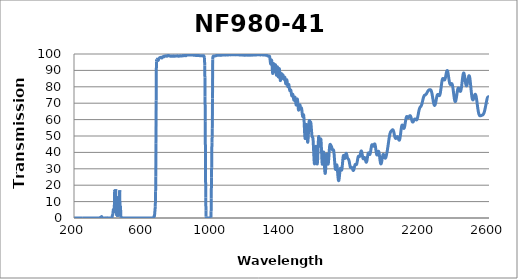
| Category | Transmission (%) |
|---|---|
| 2600.0 | 73.48 |
| 2599.0 | 73.645 |
| 2598.0 | 73.816 |
| 2597.0 | 73.891 |
| 2596.0 | 73.89 |
| 2595.0 | 73.862 |
| 2594.0 | 73.802 |
| 2593.0 | 73.691 |
| 2592.0 | 73.519 |
| 2591.0 | 73.297 |
| 2590.0 | 73.026 |
| 2589.0 | 72.665 |
| 2588.0 | 72.265 |
| 2587.0 | 71.8 |
| 2586.0 | 71.317 |
| 2585.0 | 70.806 |
| 2584.0 | 70.241 |
| 2583.0 | 69.645 |
| 2582.0 | 69.094 |
| 2581.0 | 68.533 |
| 2580.0 | 67.994 |
| 2579.0 | 67.481 |
| 2578.0 | 66.955 |
| 2577.0 | 66.455 |
| 2576.0 | 65.949 |
| 2575.0 | 65.496 |
| 2574.0 | 65.082 |
| 2573.0 | 64.707 |
| 2572.0 | 64.376 |
| 2571.0 | 64.076 |
| 2570.0 | 63.812 |
| 2569.0 | 63.601 |
| 2568.0 | 63.413 |
| 2567.0 | 63.256 |
| 2566.0 | 63.111 |
| 2565.0 | 62.979 |
| 2564.0 | 62.89 |
| 2563.0 | 62.814 |
| 2562.0 | 62.753 |
| 2561.0 | 62.719 |
| 2560.0 | 62.673 |
| 2559.0 | 62.64 |
| 2558.0 | 62.602 |
| 2557.0 | 62.563 |
| 2556.0 | 62.519 |
| 2555.0 | 62.472 |
| 2554.0 | 62.424 |
| 2553.0 | 62.378 |
| 2552.0 | 62.334 |
| 2551.0 | 62.303 |
| 2550.0 | 62.281 |
| 2549.0 | 62.283 |
| 2548.0 | 62.291 |
| 2547.0 | 62.346 |
| 2546.0 | 62.429 |
| 2545.0 | 62.564 |
| 2544.0 | 62.737 |
| 2543.0 | 62.965 |
| 2542.0 | 63.262 |
| 2541.0 | 63.615 |
| 2540.0 | 64.023 |
| 2539.0 | 64.515 |
| 2538.0 | 65.075 |
| 2537.0 | 65.663 |
| 2536.0 | 66.332 |
| 2535.0 | 67.04 |
| 2534.0 | 67.807 |
| 2533.0 | 68.609 |
| 2532.0 | 69.443 |
| 2531.0 | 70.247 |
| 2530.0 | 71.024 |
| 2529.0 | 71.798 |
| 2528.0 | 72.547 |
| 2527.0 | 73.227 |
| 2526.0 | 73.838 |
| 2525.0 | 74.342 |
| 2524.0 | 74.753 |
| 2523.0 | 75.061 |
| 2522.0 | 75.291 |
| 2521.0 | 75.414 |
| 2520.0 | 75.431 |
| 2519.0 | 75.343 |
| 2518.0 | 75.179 |
| 2517.0 | 74.941 |
| 2516.0 | 74.632 |
| 2515.0 | 74.277 |
| 2514.0 | 73.897 |
| 2513.0 | 73.502 |
| 2512.0 | 73.104 |
| 2511.0 | 72.762 |
| 2510.0 | 72.457 |
| 2509.0 | 72.216 |
| 2508.0 | 72.055 |
| 2507.0 | 71.998 |
| 2506.0 | 72.042 |
| 2505.0 | 72.205 |
| 2504.0 | 72.475 |
| 2503.0 | 72.874 |
| 2502.0 | 73.394 |
| 2501.0 | 74.021 |
| 2500.0 | 74.799 |
| 2499.0 | 75.648 |
| 2498.0 | 76.582 |
| 2497.0 | 77.574 |
| 2496.0 | 78.641 |
| 2495.0 | 79.709 |
| 2494.0 | 80.819 |
| 2493.0 | 81.905 |
| 2492.0 | 82.885 |
| 2491.0 | 83.83 |
| 2490.0 | 84.66 |
| 2489.0 | 85.374 |
| 2488.0 | 85.951 |
| 2487.0 | 86.399 |
| 2486.0 | 86.641 |
| 2485.0 | 86.753 |
| 2484.0 | 86.703 |
| 2483.0 | 86.487 |
| 2482.0 | 86.164 |
| 2481.0 | 85.706 |
| 2480.0 | 85.165 |
| 2479.0 | 84.574 |
| 2478.0 | 83.962 |
| 2477.0 | 83.313 |
| 2476.0 | 82.692 |
| 2475.0 | 82.105 |
| 2474.0 | 81.574 |
| 2473.0 | 81.156 |
| 2472.0 | 80.832 |
| 2471.0 | 80.618 |
| 2470.0 | 80.539 |
| 2469.0 | 80.588 |
| 2468.0 | 80.776 |
| 2467.0 | 81.104 |
| 2466.0 | 81.511 |
| 2465.0 | 82.063 |
| 2464.0 | 82.676 |
| 2463.0 | 83.356 |
| 2462.0 | 84.101 |
| 2461.0 | 84.879 |
| 2460.0 | 85.626 |
| 2459.0 | 86.305 |
| 2458.0 | 86.956 |
| 2457.0 | 87.514 |
| 2456.0 | 87.94 |
| 2455.0 | 88.262 |
| 2454.0 | 88.417 |
| 2453.0 | 88.401 |
| 2452.0 | 88.231 |
| 2451.0 | 87.897 |
| 2450.0 | 87.414 |
| 2449.0 | 86.792 |
| 2448.0 | 86.034 |
| 2447.0 | 85.212 |
| 2446.0 | 84.332 |
| 2445.0 | 83.421 |
| 2444.0 | 82.482 |
| 2443.0 | 81.568 |
| 2442.0 | 80.684 |
| 2441.0 | 79.868 |
| 2440.0 | 79.182 |
| 2439.0 | 78.57 |
| 2438.0 | 78.066 |
| 2437.0 | 77.67 |
| 2436.0 | 77.393 |
| 2435.0 | 77.236 |
| 2434.0 | 77.188 |
| 2433.0 | 77.232 |
| 2432.0 | 77.375 |
| 2431.0 | 77.585 |
| 2430.0 | 77.843 |
| 2429.0 | 78.139 |
| 2428.0 | 78.441 |
| 2427.0 | 78.725 |
| 2426.0 | 78.967 |
| 2425.0 | 79.174 |
| 2424.0 | 79.293 |
| 2423.0 | 79.322 |
| 2422.0 | 79.244 |
| 2421.0 | 79.073 |
| 2420.0 | 78.78 |
| 2419.0 | 78.386 |
| 2418.0 | 77.897 |
| 2417.0 | 77.31 |
| 2416.0 | 76.648 |
| 2415.0 | 75.953 |
| 2414.0 | 75.245 |
| 2413.0 | 74.509 |
| 2412.0 | 73.805 |
| 2411.0 | 73.144 |
| 2410.0 | 72.514 |
| 2409.0 | 71.986 |
| 2408.0 | 71.572 |
| 2407.0 | 71.254 |
| 2406.0 | 71.051 |
| 2405.0 | 70.975 |
| 2404.0 | 71.02 |
| 2403.0 | 71.213 |
| 2402.0 | 71.531 |
| 2401.0 | 71.955 |
| 2400.0 | 72.491 |
| 2399.0 | 73.141 |
| 2398.0 | 73.857 |
| 2397.0 | 74.664 |
| 2396.0 | 75.534 |
| 2395.0 | 76.355 |
| 2394.0 | 77.234 |
| 2393.0 | 78.05 |
| 2392.0 | 78.836 |
| 2391.0 | 79.577 |
| 2390.0 | 80.234 |
| 2389.0 | 80.783 |
| 2388.0 | 81.218 |
| 2387.0 | 81.554 |
| 2386.0 | 81.79 |
| 2385.0 | 81.924 |
| 2384.0 | 81.962 |
| 2383.0 | 81.937 |
| 2382.0 | 81.867 |
| 2381.0 | 81.743 |
| 2380.0 | 81.615 |
| 2379.0 | 81.516 |
| 2378.0 | 81.428 |
| 2377.0 | 81.401 |
| 2376.0 | 81.439 |
| 2375.0 | 81.558 |
| 2374.0 | 81.757 |
| 2373.0 | 82.072 |
| 2372.0 | 82.455 |
| 2371.0 | 82.949 |
| 2370.0 | 83.546 |
| 2369.0 | 84.166 |
| 2368.0 | 84.867 |
| 2367.0 | 85.596 |
| 2366.0 | 86.332 |
| 2365.0 | 87.086 |
| 2364.0 | 87.778 |
| 2363.0 | 88.403 |
| 2362.0 | 88.924 |
| 2361.0 | 89.36 |
| 2360.0 | 89.672 |
| 2359.0 | 89.865 |
| 2358.0 | 89.915 |
| 2357.0 | 89.815 |
| 2356.0 | 89.611 |
| 2355.0 | 89.287 |
| 2354.0 | 88.859 |
| 2353.0 | 88.369 |
| 2352.0 | 87.81 |
| 2351.0 | 87.214 |
| 2350.0 | 86.666 |
| 2349.0 | 86.13 |
| 2348.0 | 85.616 |
| 2347.0 | 85.165 |
| 2346.0 | 84.815 |
| 2345.0 | 84.521 |
| 2344.0 | 84.316 |
| 2343.0 | 84.219 |
| 2342.0 | 84.184 |
| 2341.0 | 84.228 |
| 2340.0 | 84.344 |
| 2339.0 | 84.488 |
| 2338.0 | 84.649 |
| 2337.0 | 84.813 |
| 2336.0 | 84.971 |
| 2335.0 | 85.062 |
| 2334.0 | 85.102 |
| 2333.0 | 85.073 |
| 2332.0 | 84.92 |
| 2331.0 | 84.688 |
| 2330.0 | 84.342 |
| 2329.0 | 83.886 |
| 2328.0 | 83.319 |
| 2327.0 | 82.695 |
| 2326.0 | 81.967 |
| 2325.0 | 81.157 |
| 2324.0 | 80.389 |
| 2323.0 | 79.572 |
| 2322.0 | 78.752 |
| 2321.0 | 77.996 |
| 2320.0 | 77.27 |
| 2319.0 | 76.609 |
| 2318.0 | 76.034 |
| 2317.0 | 75.582 |
| 2316.0 | 75.2 |
| 2315.0 | 74.91 |
| 2314.0 | 74.72 |
| 2313.0 | 74.625 |
| 2312.0 | 74.594 |
| 2311.0 | 74.645 |
| 2310.0 | 74.748 |
| 2309.0 | 74.876 |
| 2308.0 | 75.006 |
| 2307.0 | 75.158 |
| 2306.0 | 75.267 |
| 2305.0 | 75.321 |
| 2304.0 | 75.345 |
| 2303.0 | 75.289 |
| 2302.0 | 75.146 |
| 2301.0 | 74.937 |
| 2300.0 | 74.641 |
| 2299.0 | 74.253 |
| 2298.0 | 73.844 |
| 2297.0 | 73.347 |
| 2296.0 | 72.811 |
| 2295.0 | 72.238 |
| 2294.0 | 71.664 |
| 2293.0 | 71.085 |
| 2292.0 | 70.544 |
| 2291.0 | 70.058 |
| 2290.0 | 69.624 |
| 2289.0 | 69.247 |
| 2288.0 | 68.959 |
| 2287.0 | 68.758 |
| 2286.0 | 68.652 |
| 2285.0 | 68.634 |
| 2284.0 | 68.744 |
| 2283.0 | 68.923 |
| 2282.0 | 69.189 |
| 2281.0 | 69.565 |
| 2280.0 | 70.014 |
| 2279.0 | 70.476 |
| 2278.0 | 71.038 |
| 2277.0 | 71.641 |
| 2276.0 | 72.264 |
| 2275.0 | 72.927 |
| 2274.0 | 73.6 |
| 2273.0 | 74.25 |
| 2272.0 | 74.836 |
| 2271.0 | 75.431 |
| 2270.0 | 75.963 |
| 2269.0 | 76.422 |
| 2268.0 | 76.846 |
| 2267.0 | 77.219 |
| 2266.0 | 77.503 |
| 2265.0 | 77.741 |
| 2264.0 | 77.924 |
| 2263.0 | 78.06 |
| 2262.0 | 78.161 |
| 2261.0 | 78.226 |
| 2260.0 | 78.261 |
| 2259.0 | 78.273 |
| 2258.0 | 78.264 |
| 2257.0 | 78.247 |
| 2256.0 | 78.216 |
| 2255.0 | 78.173 |
| 2254.0 | 78.124 |
| 2253.0 | 78.062 |
| 2252.0 | 77.989 |
| 2251.0 | 77.913 |
| 2250.0 | 77.819 |
| 2249.0 | 77.701 |
| 2248.0 | 77.565 |
| 2247.0 | 77.428 |
| 2246.0 | 77.262 |
| 2245.0 | 77.087 |
| 2244.0 | 76.902 |
| 2243.0 | 76.699 |
| 2242.0 | 76.494 |
| 2241.0 | 76.286 |
| 2240.0 | 76.1 |
| 2239.0 | 75.902 |
| 2238.0 | 75.727 |
| 2237.0 | 75.577 |
| 2236.0 | 75.43 |
| 2235.0 | 75.314 |
| 2234.0 | 75.229 |
| 2233.0 | 75.156 |
| 2232.0 | 75.091 |
| 2231.0 | 75.046 |
| 2230.0 | 74.994 |
| 2229.0 | 74.944 |
| 2228.0 | 74.886 |
| 2227.0 | 74.808 |
| 2226.0 | 74.685 |
| 2225.0 | 74.539 |
| 2224.0 | 74.351 |
| 2223.0 | 74.108 |
| 2222.0 | 73.822 |
| 2221.0 | 73.502 |
| 2220.0 | 73.138 |
| 2219.0 | 72.728 |
| 2218.0 | 72.288 |
| 2217.0 | 71.837 |
| 2216.0 | 71.35 |
| 2215.0 | 70.902 |
| 2214.0 | 70.453 |
| 2213.0 | 70.024 |
| 2212.0 | 69.616 |
| 2211.0 | 69.269 |
| 2210.0 | 68.939 |
| 2209.0 | 68.655 |
| 2208.0 | 68.435 |
| 2207.0 | 68.238 |
| 2206.0 | 68.068 |
| 2205.0 | 67.94 |
| 2204.0 | 67.816 |
| 2203.0 | 67.692 |
| 2202.0 | 67.549 |
| 2201.0 | 67.406 |
| 2200.0 | 67.214 |
| 2199.0 | 66.971 |
| 2198.0 | 66.693 |
| 2197.0 | 66.351 |
| 2196.0 | 65.948 |
| 2195.0 | 65.509 |
| 2194.0 | 65.024 |
| 2193.0 | 64.483 |
| 2192.0 | 63.94 |
| 2191.0 | 63.362 |
| 2190.0 | 62.793 |
| 2189.0 | 62.258 |
| 2188.0 | 61.761 |
| 2187.0 | 61.277 |
| 2186.0 | 60.868 |
| 2185.0 | 60.537 |
| 2184.0 | 60.243 |
| 2183.0 | 60.035 |
| 2182.0 | 59.906 |
| 2181.0 | 59.826 |
| 2180.0 | 59.809 |
| 2179.0 | 59.844 |
| 2178.0 | 59.92 |
| 2177.0 | 60.008 |
| 2176.0 | 60.11 |
| 2175.0 | 60.217 |
| 2174.0 | 60.302 |
| 2173.0 | 60.358 |
| 2172.0 | 60.383 |
| 2171.0 | 60.359 |
| 2170.0 | 60.28 |
| 2169.0 | 60.165 |
| 2168.0 | 60.013 |
| 2167.0 | 59.803 |
| 2166.0 | 59.594 |
| 2165.0 | 59.365 |
| 2164.0 | 59.128 |
| 2163.0 | 58.923 |
| 2162.0 | 58.749 |
| 2161.0 | 58.607 |
| 2160.0 | 58.517 |
| 2159.0 | 58.501 |
| 2158.0 | 58.539 |
| 2157.0 | 58.665 |
| 2156.0 | 58.853 |
| 2155.0 | 59.108 |
| 2154.0 | 59.414 |
| 2153.0 | 59.765 |
| 2152.0 | 60.166 |
| 2151.0 | 60.567 |
| 2150.0 | 60.958 |
| 2149.0 | 61.335 |
| 2148.0 | 61.674 |
| 2147.0 | 61.95 |
| 2146.0 | 62.184 |
| 2145.0 | 62.34 |
| 2144.0 | 62.414 |
| 2143.0 | 62.418 |
| 2142.0 | 62.358 |
| 2141.0 | 62.243 |
| 2140.0 | 62.091 |
| 2139.0 | 61.909 |
| 2138.0 | 61.715 |
| 2137.0 | 61.548 |
| 2136.0 | 61.387 |
| 2135.0 | 61.267 |
| 2134.0 | 61.195 |
| 2133.0 | 61.173 |
| 2132.0 | 61.205 |
| 2131.0 | 61.277 |
| 2130.0 | 61.378 |
| 2129.0 | 61.521 |
| 2128.0 | 61.647 |
| 2127.0 | 61.766 |
| 2126.0 | 61.852 |
| 2125.0 | 61.882 |
| 2124.0 | 61.822 |
| 2123.0 | 61.689 |
| 2122.0 | 61.444 |
| 2121.0 | 61.105 |
| 2120.0 | 60.643 |
| 2119.0 | 60.122 |
| 2118.0 | 59.53 |
| 2117.0 | 58.871 |
| 2116.0 | 58.2 |
| 2115.0 | 57.515 |
| 2114.0 | 56.831 |
| 2113.0 | 56.22 |
| 2112.0 | 55.701 |
| 2111.0 | 55.265 |
| 2110.0 | 54.931 |
| 2109.0 | 54.726 |
| 2108.0 | 54.636 |
| 2107.0 | 54.646 |
| 2106.0 | 54.795 |
| 2105.0 | 55.013 |
| 2104.0 | 55.291 |
| 2103.0 | 55.623 |
| 2102.0 | 55.955 |
| 2101.0 | 56.256 |
| 2100.0 | 56.51 |
| 2099.0 | 56.663 |
| 2098.0 | 56.703 |
| 2097.0 | 56.618 |
| 2096.0 | 56.375 |
| 2095.0 | 55.997 |
| 2094.0 | 55.463 |
| 2093.0 | 54.796 |
| 2092.0 | 54.087 |
| 2091.0 | 53.266 |
| 2090.0 | 52.402 |
| 2089.0 | 51.536 |
| 2088.0 | 50.681 |
| 2087.0 | 49.887 |
| 2086.0 | 49.203 |
| 2085.0 | 48.611 |
| 2084.0 | 48.133 |
| 2083.0 | 47.773 |
| 2082.0 | 47.553 |
| 2081.0 | 47.446 |
| 2080.0 | 47.465 |
| 2079.0 | 47.586 |
| 2078.0 | 47.769 |
| 2077.0 | 48.042 |
| 2076.0 | 48.322 |
| 2075.0 | 48.636 |
| 2074.0 | 48.939 |
| 2073.0 | 49.193 |
| 2072.0 | 49.405 |
| 2071.0 | 49.546 |
| 2070.0 | 49.627 |
| 2069.0 | 49.628 |
| 2068.0 | 49.558 |
| 2067.0 | 49.439 |
| 2066.0 | 49.283 |
| 2065.0 | 49.1 |
| 2064.0 | 48.902 |
| 2063.0 | 48.734 |
| 2062.0 | 48.599 |
| 2061.0 | 48.511 |
| 2060.0 | 48.518 |
| 2059.0 | 48.582 |
| 2058.0 | 48.739 |
| 2057.0 | 48.976 |
| 2056.0 | 49.307 |
| 2055.0 | 49.702 |
| 2054.0 | 50.144 |
| 2053.0 | 50.632 |
| 2052.0 | 51.136 |
| 2051.0 | 51.632 |
| 2050.0 | 52.117 |
| 2049.0 | 52.567 |
| 2048.0 | 52.96 |
| 2047.0 | 53.273 |
| 2046.0 | 53.521 |
| 2045.0 | 53.683 |
| 2044.0 | 53.789 |
| 2043.0 | 53.816 |
| 2042.0 | 53.798 |
| 2041.0 | 53.727 |
| 2040.0 | 53.64 |
| 2039.0 | 53.522 |
| 2038.0 | 53.4 |
| 2037.0 | 53.277 |
| 2036.0 | 53.157 |
| 2035.0 | 53.04 |
| 2034.0 | 52.923 |
| 2033.0 | 52.807 |
| 2032.0 | 52.655 |
| 2031.0 | 52.485 |
| 2030.0 | 52.274 |
| 2029.0 | 52.01 |
| 2028.0 | 51.693 |
| 2027.0 | 51.311 |
| 2026.0 | 50.866 |
| 2025.0 | 50.344 |
| 2024.0 | 49.755 |
| 2023.0 | 49.111 |
| 2022.0 | 48.435 |
| 2021.0 | 47.736 |
| 2020.0 | 46.988 |
| 2019.0 | 46.234 |
| 2018.0 | 45.482 |
| 2017.0 | 44.718 |
| 2016.0 | 43.971 |
| 2015.0 | 43.265 |
| 2014.0 | 42.573 |
| 2013.0 | 41.892 |
| 2012.0 | 41.252 |
| 2011.0 | 40.613 |
| 2010.0 | 40 |
| 2009.0 | 39.447 |
| 2008.0 | 38.922 |
| 2007.0 | 38.428 |
| 2006.0 | 37.958 |
| 2005.0 | 37.552 |
| 2004.0 | 37.187 |
| 2003.0 | 36.89 |
| 2002.0 | 36.679 |
| 2001.0 | 36.536 |
| 2000.0 | 36.471 |
| 1999.0 | 36.491 |
| 1998.0 | 36.598 |
| 1997.0 | 36.78 |
| 1996.0 | 37.019 |
| 1995.0 | 37.32 |
| 1994.0 | 37.652 |
| 1993.0 | 37.978 |
| 1992.0 | 38.287 |
| 1991.0 | 38.554 |
| 1990.0 | 38.732 |
| 1989.0 | 38.809 |
| 1988.0 | 38.761 |
| 1987.0 | 38.589 |
| 1986.0 | 38.28 |
| 1985.0 | 37.842 |
| 1984.0 | 37.296 |
| 1983.0 | 36.7 |
| 1982.0 | 36.034 |
| 1981.0 | 35.357 |
| 1980.0 | 34.705 |
| 1979.0 | 34.118 |
| 1978.0 | 33.615 |
| 1977.0 | 33.248 |
| 1976.0 | 33.027 |
| 1975.0 | 32.957 |
| 1974.0 | 33.064 |
| 1973.0 | 33.334 |
| 1972.0 | 33.793 |
| 1971.0 | 34.388 |
| 1970.0 | 35.086 |
| 1969.0 | 35.899 |
| 1968.0 | 36.766 |
| 1967.0 | 37.624 |
| 1966.0 | 38.481 |
| 1965.0 | 39.26 |
| 1964.0 | 39.862 |
| 1963.0 | 40.336 |
| 1962.0 | 40.614 |
| 1961.0 | 40.723 |
| 1960.0 | 40.645 |
| 1959.0 | 40.419 |
| 1958.0 | 40.09 |
| 1957.0 | 39.701 |
| 1956.0 | 39.291 |
| 1955.0 | 38.925 |
| 1954.0 | 38.632 |
| 1953.0 | 38.451 |
| 1952.0 | 38.431 |
| 1951.0 | 38.567 |
| 1950.0 | 38.859 |
| 1949.0 | 39.324 |
| 1948.0 | 39.913 |
| 1947.0 | 40.636 |
| 1946.0 | 41.44 |
| 1945.0 | 42.23 |
| 1944.0 | 43 |
| 1943.0 | 43.7 |
| 1942.0 | 44.296 |
| 1941.0 | 44.753 |
| 1940.0 | 45.045 |
| 1939.0 | 45.177 |
| 1938.0 | 45.166 |
| 1937.0 | 45.017 |
| 1936.0 | 44.8 |
| 1935.0 | 44.529 |
| 1934.0 | 44.26 |
| 1933.0 | 44.025 |
| 1932.0 | 43.872 |
| 1931.0 | 43.803 |
| 1930.0 | 43.819 |
| 1929.0 | 43.919 |
| 1928.0 | 44.088 |
| 1927.0 | 44.296 |
| 1926.0 | 44.494 |
| 1925.0 | 44.651 |
| 1924.0 | 44.719 |
| 1923.0 | 44.665 |
| 1922.0 | 44.485 |
| 1921.0 | 44.133 |
| 1920.0 | 43.624 |
| 1919.0 | 43.063 |
| 1918.0 | 42.412 |
| 1917.0 | 41.715 |
| 1916.0 | 41.006 |
| 1915.0 | 40.346 |
| 1914.0 | 39.767 |
| 1913.0 | 39.279 |
| 1912.0 | 38.946 |
| 1911.0 | 38.719 |
| 1910.0 | 38.645 |
| 1909.0 | 38.709 |
| 1908.0 | 38.873 |
| 1907.0 | 39.089 |
| 1906.0 | 39.337 |
| 1905.0 | 39.544 |
| 1904.0 | 39.689 |
| 1903.0 | 39.713 |
| 1902.0 | 39.589 |
| 1901.0 | 39.292 |
| 1900.0 | 38.857 |
| 1899.0 | 38.298 |
| 1898.0 | 37.655 |
| 1897.0 | 36.943 |
| 1896.0 | 36.262 |
| 1895.0 | 35.581 |
| 1894.0 | 35.01 |
| 1893.0 | 34.563 |
| 1892.0 | 34.223 |
| 1891.0 | 34.026 |
| 1890.0 | 33.987 |
| 1889.0 | 34.1 |
| 1888.0 | 34.355 |
| 1887.0 | 34.705 |
| 1886.0 | 35.122 |
| 1885.0 | 35.576 |
| 1884.0 | 36.002 |
| 1883.0 | 36.393 |
| 1882.0 | 36.692 |
| 1881.0 | 36.875 |
| 1880.0 | 36.933 |
| 1879.0 | 36.889 |
| 1878.0 | 36.755 |
| 1877.0 | 36.565 |
| 1876.0 | 36.362 |
| 1875.0 | 36.175 |
| 1874.0 | 36.07 |
| 1873.0 | 36.051 |
| 1872.0 | 36.172 |
| 1871.0 | 36.44 |
| 1870.0 | 36.842 |
| 1869.0 | 37.361 |
| 1868.0 | 37.97 |
| 1867.0 | 38.597 |
| 1866.0 | 39.245 |
| 1865.0 | 39.822 |
| 1864.0 | 40.298 |
| 1863.0 | 40.685 |
| 1862.0 | 40.88 |
| 1861.0 | 40.891 |
| 1860.0 | 40.724 |
| 1859.0 | 40.415 |
| 1858.0 | 40.002 |
| 1857.0 | 39.485 |
| 1856.0 | 38.953 |
| 1855.0 | 38.475 |
| 1854.0 | 38.068 |
| 1853.0 | 37.752 |
| 1852.0 | 37.53 |
| 1851.0 | 37.432 |
| 1850.0 | 37.427 |
| 1849.0 | 37.484 |
| 1848.0 | 37.567 |
| 1847.0 | 37.654 |
| 1846.0 | 37.695 |
| 1845.0 | 37.648 |
| 1844.0 | 37.472 |
| 1843.0 | 37.177 |
| 1842.0 | 36.763 |
| 1841.0 | 36.25 |
| 1840.0 | 35.65 |
| 1839.0 | 34.998 |
| 1838.0 | 34.375 |
| 1837.0 | 33.781 |
| 1836.0 | 33.323 |
| 1835.0 | 32.949 |
| 1834.0 | 32.681 |
| 1833.0 | 32.523 |
| 1832.0 | 32.469 |
| 1831.0 | 32.494 |
| 1830.0 | 32.57 |
| 1829.0 | 32.64 |
| 1828.0 | 32.683 |
| 1827.0 | 32.674 |
| 1826.0 | 32.569 |
| 1825.0 | 32.373 |
| 1824.0 | 32.071 |
| 1823.0 | 31.672 |
| 1822.0 | 31.22 |
| 1821.0 | 30.713 |
| 1820.0 | 30.221 |
| 1819.0 | 29.763 |
| 1818.0 | 29.384 |
| 1817.0 | 29.128 |
| 1816.0 | 28.99 |
| 1815.0 | 28.954 |
| 1814.0 | 29.041 |
| 1813.0 | 29.218 |
| 1812.0 | 29.471 |
| 1811.0 | 29.768 |
| 1810.0 | 30.065 |
| 1809.0 | 30.355 |
| 1808.0 | 30.581 |
| 1807.0 | 30.761 |
| 1806.0 | 30.855 |
| 1805.0 | 30.875 |
| 1804.0 | 30.842 |
| 1803.0 | 30.783 |
| 1802.0 | 30.718 |
| 1801.0 | 30.692 |
| 1800.0 | 30.738 |
| 1799.0 | 30.869 |
| 1798.0 | 31.112 |
| 1797.0 | 31.451 |
| 1796.0 | 31.889 |
| 1795.0 | 32.418 |
| 1794.0 | 32.994 |
| 1793.0 | 33.599 |
| 1792.0 | 34.193 |
| 1791.0 | 34.704 |
| 1790.0 | 35.138 |
| 1789.0 | 35.482 |
| 1788.0 | 35.727 |
| 1787.0 | 35.895 |
| 1786.0 | 35.999 |
| 1785.0 | 36.087 |
| 1784.0 | 36.197 |
| 1783.0 | 36.366 |
| 1782.0 | 36.616 |
| 1781.0 | 36.941 |
| 1780.0 | 37.381 |
| 1779.0 | 37.861 |
| 1778.0 | 38.345 |
| 1777.0 | 38.797 |
| 1776.0 | 39.159 |
| 1775.0 | 39.375 |
| 1774.0 | 39.415 |
| 1773.0 | 39.256 |
| 1772.0 | 38.923 |
| 1771.0 | 38.465 |
| 1770.0 | 37.926 |
| 1769.0 | 37.362 |
| 1768.0 | 36.889 |
| 1767.0 | 36.515 |
| 1766.0 | 36.324 |
| 1765.0 | 36.33 |
| 1764.0 | 36.524 |
| 1763.0 | 36.856 |
| 1762.0 | 37.279 |
| 1761.0 | 37.724 |
| 1760.0 | 38.062 |
| 1759.0 | 38.202 |
| 1758.0 | 38.083 |
| 1757.0 | 37.66 |
| 1756.0 | 36.921 |
| 1755.0 | 35.927 |
| 1754.0 | 34.727 |
| 1753.0 | 33.446 |
| 1752.0 | 32.251 |
| 1751.0 | 31.167 |
| 1750.0 | 30.255 |
| 1749.0 | 29.599 |
| 1748.0 | 29.217 |
| 1747.0 | 29.096 |
| 1746.0 | 29.197 |
| 1745.0 | 29.468 |
| 1744.0 | 29.817 |
| 1743.0 | 30.155 |
| 1742.0 | 30.37 |
| 1741.0 | 30.374 |
| 1740.0 | 30.1 |
| 1739.0 | 29.555 |
| 1738.0 | 28.755 |
| 1737.0 | 27.721 |
| 1736.0 | 26.61 |
| 1735.0 | 25.468 |
| 1734.0 | 24.448 |
| 1733.0 | 23.632 |
| 1732.0 | 23.056 |
| 1731.0 | 22.76 |
| 1730.0 | 22.768 |
| 1729.0 | 23.105 |
| 1728.0 | 23.776 |
| 1727.0 | 24.721 |
| 1726.0 | 25.904 |
| 1725.0 | 27.25 |
| 1724.0 | 28.686 |
| 1723.0 | 30.003 |
| 1722.0 | 31.185 |
| 1721.0 | 31.984 |
| 1720.0 | 32.376 |
| 1719.0 | 32.389 |
| 1718.0 | 32.05 |
| 1717.0 | 31.492 |
| 1716.0 | 30.82 |
| 1715.0 | 30.206 |
| 1714.0 | 29.764 |
| 1713.0 | 29.576 |
| 1712.0 | 29.691 |
| 1711.0 | 30.145 |
| 1710.0 | 30.944 |
| 1709.0 | 32.072 |
| 1708.0 | 33.432 |
| 1707.0 | 34.92 |
| 1706.0 | 36.458 |
| 1705.0 | 37.972 |
| 1704.0 | 39.232 |
| 1703.0 | 40.302 |
| 1702.0 | 41.025 |
| 1701.0 | 41.409 |
| 1700.0 | 41.555 |
| 1699.0 | 41.537 |
| 1698.0 | 41.452 |
| 1697.0 | 41.368 |
| 1696.0 | 41.366 |
| 1695.0 | 41.489 |
| 1694.0 | 41.704 |
| 1693.0 | 42.037 |
| 1692.0 | 42.43 |
| 1691.0 | 42.827 |
| 1690.0 | 43.21 |
| 1689.0 | 43.545 |
| 1688.0 | 43.802 |
| 1687.0 | 44.024 |
| 1686.0 | 44.222 |
| 1685.0 | 44.41 |
| 1684.0 | 44.603 |
| 1683.0 | 44.781 |
| 1682.0 | 44.894 |
| 1681.0 | 44.878 |
| 1680.0 | 44.665 |
| 1679.0 | 44.163 |
| 1678.0 | 43.343 |
| 1677.0 | 42.157 |
| 1676.0 | 40.698 |
| 1675.0 | 39.156 |
| 1674.0 | 37.481 |
| 1673.0 | 35.91 |
| 1672.0 | 34.585 |
| 1671.0 | 33.565 |
| 1670.0 | 32.98 |
| 1669.0 | 32.85 |
| 1668.0 | 33.169 |
| 1667.0 | 33.923 |
| 1666.0 | 35.025 |
| 1665.0 | 36.317 |
| 1664.0 | 37.601 |
| 1663.0 | 38.577 |
| 1662.0 | 39.037 |
| 1661.0 | 38.838 |
| 1660.0 | 37.92 |
| 1659.0 | 36.431 |
| 1658.0 | 34.449 |
| 1657.0 | 32.342 |
| 1656.0 | 30.523 |
| 1655.0 | 28.921 |
| 1654.0 | 27.803 |
| 1653.0 | 27.229 |
| 1652.0 | 27.244 |
| 1651.0 | 27.883 |
| 1650.0 | 29.114 |
| 1649.0 | 30.819 |
| 1648.0 | 32.986 |
| 1647.0 | 35.299 |
| 1646.0 | 37.463 |
| 1645.0 | 39.205 |
| 1644.0 | 40.152 |
| 1643.0 | 40.212 |
| 1642.0 | 39.447 |
| 1641.0 | 38.04 |
| 1640.0 | 36.405 |
| 1639.0 | 34.753 |
| 1638.0 | 33.49 |
| 1637.0 | 32.825 |
| 1636.0 | 32.803 |
| 1635.0 | 33.487 |
| 1634.0 | 34.872 |
| 1633.0 | 36.909 |
| 1632.0 | 39.484 |
| 1631.0 | 42.211 |
| 1630.0 | 44.684 |
| 1629.0 | 46.726 |
| 1628.0 | 47.919 |
| 1627.0 | 48.192 |
| 1626.0 | 47.626 |
| 1625.0 | 46.531 |
| 1624.0 | 45.318 |
| 1623.0 | 44.301 |
| 1622.0 | 43.745 |
| 1621.0 | 43.821 |
| 1620.0 | 44.573 |
| 1619.0 | 45.883 |
| 1618.0 | 47.385 |
| 1617.0 | 48.779 |
| 1616.0 | 49.629 |
| 1615.0 | 49.591 |
| 1614.0 | 48.502 |
| 1613.0 | 46.365 |
| 1612.0 | 43.556 |
| 1611.0 | 40.687 |
| 1610.0 | 37.804 |
| 1609.0 | 35.495 |
| 1608.0 | 33.873 |
| 1607.0 | 33.002 |
| 1606.0 | 32.979 |
| 1605.0 | 33.708 |
| 1604.0 | 35.095 |
| 1603.0 | 37.071 |
| 1602.0 | 39.24 |
| 1601.0 | 41.377 |
| 1600.0 | 43 |
| 1599.0 | 43.694 |
| 1598.0 | 43.379 |
| 1597.0 | 42.133 |
| 1596.0 | 40.188 |
| 1595.0 | 38.052 |
| 1594.0 | 35.939 |
| 1593.0 | 34.275 |
| 1592.0 | 33.287 |
| 1591.0 | 32.923 |
| 1590.0 | 33.279 |
| 1589.0 | 34.305 |
| 1588.0 | 35.945 |
| 1587.0 | 38.139 |
| 1586.0 | 40.568 |
| 1585.0 | 42.979 |
| 1584.0 | 45.254 |
| 1583.0 | 47.091 |
| 1582.0 | 48.339 |
| 1581.0 | 49.033 |
| 1580.0 | 49.276 |
| 1579.0 | 49.316 |
| 1578.0 | 49.393 |
| 1577.0 | 49.702 |
| 1576.0 | 50.337 |
| 1575.0 | 51.377 |
| 1574.0 | 52.737 |
| 1573.0 | 54.135 |
| 1572.0 | 55.579 |
| 1571.0 | 56.823 |
| 1570.0 | 57.765 |
| 1569.0 | 58.328 |
| 1568.0 | 58.569 |
| 1567.0 | 58.615 |
| 1566.0 | 58.613 |
| 1565.0 | 58.678 |
| 1564.0 | 58.881 |
| 1563.0 | 59.173 |
| 1562.0 | 59.424 |
| 1561.0 | 59.438 |
| 1560.0 | 59.053 |
| 1559.0 | 58.105 |
| 1558.0 | 56.571 |
| 1557.0 | 54.63 |
| 1556.0 | 52.341 |
| 1555.0 | 50.112 |
| 1554.0 | 48.276 |
| 1553.0 | 46.907 |
| 1552.0 | 46.218 |
| 1551.0 | 46.264 |
| 1550.0 | 47.051 |
| 1549.0 | 48.579 |
| 1548.0 | 50.581 |
| 1547.0 | 52.719 |
| 1546.0 | 54.792 |
| 1545.0 | 56.331 |
| 1544.0 | 57.04 |
| 1543.0 | 56.744 |
| 1542.0 | 55.582 |
| 1541.0 | 53.877 |
| 1540.0 | 51.982 |
| 1539.0 | 50.244 |
| 1538.0 | 49.017 |
| 1537.0 | 48.45 |
| 1536.0 | 48.669 |
| 1535.0 | 49.626 |
| 1534.0 | 51.296 |
| 1533.0 | 53.458 |
| 1532.0 | 55.927 |
| 1531.0 | 58.353 |
| 1530.0 | 60.519 |
| 1529.0 | 62.029 |
| 1528.0 | 62.816 |
| 1527.0 | 63.036 |
| 1526.0 | 62.773 |
| 1525.0 | 62.319 |
| 1524.0 | 61.935 |
| 1523.0 | 61.788 |
| 1522.0 | 62.013 |
| 1521.0 | 62.581 |
| 1520.0 | 63.457 |
| 1519.0 | 64.441 |
| 1518.0 | 65.451 |
| 1517.0 | 66.289 |
| 1516.0 | 66.846 |
| 1515.0 | 67.138 |
| 1514.0 | 67.223 |
| 1513.0 | 67.183 |
| 1512.0 | 67.175 |
| 1511.0 | 67.293 |
| 1510.0 | 67.577 |
| 1509.0 | 67.965 |
| 1508.0 | 68.442 |
| 1507.0 | 68.846 |
| 1506.0 | 69.046 |
| 1505.0 | 68.973 |
| 1504.0 | 68.566 |
| 1503.0 | 67.906 |
| 1502.0 | 67.157 |
| 1501.0 | 66.42 |
| 1500.0 | 65.888 |
| 1499.0 | 65.733 |
| 1498.0 | 66.032 |
| 1497.0 | 66.782 |
| 1496.0 | 67.881 |
| 1495.0 | 69.194 |
| 1494.0 | 70.564 |
| 1493.0 | 71.671 |
| 1492.0 | 72.423 |
| 1491.0 | 72.618 |
| 1490.0 | 72.297 |
| 1489.0 | 71.589 |
| 1488.0 | 70.686 |
| 1487.0 | 69.801 |
| 1486.0 | 69.148 |
| 1485.0 | 68.887 |
| 1484.0 | 69.076 |
| 1483.0 | 69.623 |
| 1482.0 | 70.517 |
| 1481.0 | 71.577 |
| 1480.0 | 72.547 |
| 1479.0 | 73.31 |
| 1478.0 | 73.695 |
| 1477.0 | 73.658 |
| 1476.0 | 73.323 |
| 1475.0 | 72.793 |
| 1474.0 | 72.271 |
| 1473.0 | 71.892 |
| 1472.0 | 71.812 |
| 1471.0 | 72.057 |
| 1470.0 | 72.587 |
| 1469.0 | 73.329 |
| 1468.0 | 74.138 |
| 1467.0 | 74.821 |
| 1466.0 | 75.31 |
| 1465.0 | 75.461 |
| 1464.0 | 75.337 |
| 1463.0 | 75.019 |
| 1462.0 | 74.663 |
| 1461.0 | 74.401 |
| 1460.0 | 74.375 |
| 1459.0 | 74.654 |
| 1458.0 | 75.191 |
| 1457.0 | 75.914 |
| 1456.0 | 76.713 |
| 1455.0 | 77.406 |
| 1454.0 | 77.885 |
| 1453.0 | 78.078 |
| 1452.0 | 78.011 |
| 1451.0 | 77.791 |
| 1450.0 | 77.576 |
| 1449.0 | 77.502 |
| 1448.0 | 77.672 |
| 1447.0 | 78.154 |
| 1446.0 | 78.918 |
| 1445.0 | 79.751 |
| 1444.0 | 80.572 |
| 1443.0 | 81.16 |
| 1442.0 | 81.414 |
| 1441.0 | 81.323 |
| 1440.0 | 80.948 |
| 1439.0 | 80.496 |
| 1438.0 | 80.139 |
| 1437.0 | 80.034 |
| 1436.0 | 80.314 |
| 1435.0 | 80.956 |
| 1434.0 | 81.892 |
| 1433.0 | 82.882 |
| 1432.0 | 83.728 |
| 1431.0 | 84.216 |
| 1430.0 | 84.265 |
| 1429.0 | 83.888 |
| 1428.0 | 83.189 |
| 1427.0 | 82.447 |
| 1426.0 | 81.931 |
| 1425.0 | 81.765 |
| 1424.0 | 82.037 |
| 1423.0 | 82.728 |
| 1422.0 | 83.663 |
| 1421.0 | 84.638 |
| 1420.0 | 85.436 |
| 1419.0 | 85.859 |
| 1418.0 | 85.89 |
| 1417.0 | 85.599 |
| 1416.0 | 85.164 |
| 1415.0 | 84.748 |
| 1414.0 | 84.566 |
| 1413.0 | 84.708 |
| 1412.0 | 85.143 |
| 1411.0 | 85.76 |
| 1410.0 | 86.441 |
| 1409.0 | 86.997 |
| 1408.0 | 87.296 |
| 1407.0 | 87.352 |
| 1406.0 | 87.254 |
| 1405.0 | 87.121 |
| 1404.0 | 87.105 |
| 1403.0 | 87.273 |
| 1402.0 | 87.572 |
| 1401.0 | 87.899 |
| 1400.0 | 88.055 |
| 1399.0 | 87.889 |
| 1398.0 | 87.309 |
| 1397.0 | 86.399 |
| 1396.0 | 85.241 |
| 1395.0 | 84.259 |
| 1394.0 | 83.769 |
| 1393.0 | 83.974 |
| 1392.0 | 84.878 |
| 1391.0 | 86.355 |
| 1390.0 | 88.119 |
| 1389.0 | 89.753 |
| 1388.0 | 90.811 |
| 1387.0 | 91.06 |
| 1386.0 | 90.432 |
| 1385.0 | 89.195 |
| 1384.0 | 87.743 |
| 1383.0 | 86.553 |
| 1382.0 | 86.061 |
| 1381.0 | 86.417 |
| 1380.0 | 87.611 |
| 1379.0 | 89.178 |
| 1378.0 | 90.777 |
| 1377.0 | 91.894 |
| 1376.0 | 92.178 |
| 1375.0 | 91.533 |
| 1374.0 | 90.256 |
| 1373.0 | 88.759 |
| 1372.0 | 87.563 |
| 1371.0 | 87.061 |
| 1370.0 | 87.467 |
| 1369.0 | 88.66 |
| 1368.0 | 90.352 |
| 1367.0 | 91.975 |
| 1366.0 | 93.123 |
| 1365.0 | 93.392 |
| 1364.0 | 92.864 |
| 1363.0 | 91.711 |
| 1362.0 | 90.48 |
| 1361.0 | 89.515 |
| 1360.0 | 89.235 |
| 1359.0 | 89.781 |
| 1358.0 | 90.966 |
| 1357.0 | 92.422 |
| 1356.0 | 93.63 |
| 1355.0 | 94.17 |
| 1354.0 | 93.843 |
| 1353.0 | 92.702 |
| 1352.0 | 91.066 |
| 1351.0 | 89.434 |
| 1350.0 | 88.395 |
| 1349.0 | 88.144 |
| 1348.0 | 88.817 |
| 1347.0 | 90.281 |
| 1346.0 | 92.125 |
| 1345.0 | 94.049 |
| 1344.0 | 95.513 |
| 1343.0 | 96.216 |
| 1342.0 | 96.205 |
| 1341.0 | 95.637 |
| 1340.0 | 94.862 |
| 1339.0 | 94.164 |
| 1338.0 | 93.866 |
| 1337.0 | 94.052 |
| 1336.0 | 94.612 |
| 1335.0 | 95.487 |
| 1334.0 | 96.434 |
| 1333.0 | 97.307 |
| 1332.0 | 97.988 |
| 1331.0 | 98.418 |
| 1330.0 | 98.648 |
| 1329.0 | 98.714 |
| 1328.0 | 98.753 |
| 1327.0 | 98.742 |
| 1326.0 | 98.734 |
| 1325.0 | 98.733 |
| 1324.0 | 98.74 |
| 1323.0 | 98.731 |
| 1322.0 | 98.725 |
| 1321.0 | 98.758 |
| 1320.0 | 98.815 |
| 1319.0 | 98.909 |
| 1318.0 | 99.024 |
| 1317.0 | 99.105 |
| 1316.0 | 99.183 |
| 1315.0 | 99.223 |
| 1314.0 | 99.231 |
| 1313.0 | 99.207 |
| 1312.0 | 99.2 |
| 1311.0 | 99.218 |
| 1310.0 | 99.225 |
| 1309.0 | 99.266 |
| 1308.0 | 99.302 |
| 1307.0 | 99.32 |
| 1306.0 | 99.344 |
| 1305.0 | 99.354 |
| 1304.0 | 99.389 |
| 1303.0 | 99.422 |
| 1302.0 | 99.471 |
| 1301.0 | 99.515 |
| 1300.0 | 99.525 |
| 1299.0 | 99.522 |
| 1298.0 | 99.483 |
| 1297.0 | 99.413 |
| 1296.0 | 99.346 |
| 1295.0 | 99.323 |
| 1294.0 | 99.321 |
| 1293.0 | 99.344 |
| 1292.0 | 99.392 |
| 1291.0 | 99.447 |
| 1290.0 | 99.48 |
| 1289.0 | 99.521 |
| 1288.0 | 99.535 |
| 1287.0 | 99.545 |
| 1286.0 | 99.557 |
| 1285.0 | 99.578 |
| 1284.0 | 99.578 |
| 1283.0 | 99.566 |
| 1282.0 | 99.547 |
| 1281.0 | 99.511 |
| 1280.0 | 99.462 |
| 1279.0 | 99.449 |
| 1278.0 | 99.424 |
| 1277.0 | 99.417 |
| 1276.0 | 99.446 |
| 1275.0 | 99.473 |
| 1274.0 | 99.484 |
| 1273.0 | 99.493 |
| 1272.0 | 99.501 |
| 1271.0 | 99.506 |
| 1270.0 | 99.515 |
| 1269.0 | 99.542 |
| 1268.0 | 99.565 |
| 1267.0 | 99.571 |
| 1266.0 | 99.573 |
| 1265.0 | 99.533 |
| 1264.0 | 99.495 |
| 1263.0 | 99.475 |
| 1262.0 | 99.473 |
| 1261.0 | 99.49 |
| 1260.0 | 99.529 |
| 1259.0 | 99.567 |
| 1258.0 | 99.574 |
| 1257.0 | 99.561 |
| 1256.0 | 99.522 |
| 1255.0 | 99.464 |
| 1254.0 | 99.414 |
| 1253.0 | 99.392 |
| 1252.0 | 99.398 |
| 1251.0 | 99.399 |
| 1250.0 | 99.412 |
| 1249.0 | 99.429 |
| 1248.0 | 99.391 |
| 1247.0 | 99.367 |
| 1246.0 | 99.368 |
| 1245.0 | 99.36 |
| 1244.0 | 99.354 |
| 1243.0 | 99.395 |
| 1242.0 | 99.399 |
| 1241.0 | 99.396 |
| 1240.0 | 99.387 |
| 1239.0 | 99.385 |
| 1238.0 | 99.379 |
| 1237.0 | 99.408 |
| 1236.0 | 99.415 |
| 1235.0 | 99.403 |
| 1234.0 | 99.388 |
| 1233.0 | 99.363 |
| 1232.0 | 99.34 |
| 1231.0 | 99.3 |
| 1230.0 | 99.321 |
| 1229.0 | 99.35 |
| 1228.0 | 99.374 |
| 1227.0 | 99.377 |
| 1226.0 | 99.363 |
| 1225.0 | 99.315 |
| 1224.0 | 99.279 |
| 1223.0 | 99.254 |
| 1222.0 | 99.257 |
| 1221.0 | 99.285 |
| 1220.0 | 99.331 |
| 1219.0 | 99.375 |
| 1218.0 | 99.363 |
| 1217.0 | 99.356 |
| 1216.0 | 99.345 |
| 1215.0 | 99.298 |
| 1214.0 | 99.303 |
| 1213.0 | 99.331 |
| 1212.0 | 99.328 |
| 1211.0 | 99.338 |
| 1210.0 | 99.332 |
| 1209.0 | 99.299 |
| 1208.0 | 99.269 |
| 1207.0 | 99.287 |
| 1206.0 | 99.285 |
| 1205.0 | 99.29 |
| 1204.0 | 99.343 |
| 1203.0 | 99.346 |
| 1202.0 | 99.325 |
| 1201.0 | 99.306 |
| 1200.0 | 99.299 |
| 1199.0 | 99.299 |
| 1198.0 | 99.329 |
| 1197.0 | 99.366 |
| 1196.0 | 99.377 |
| 1195.0 | 99.356 |
| 1194.0 | 99.321 |
| 1193.0 | 99.305 |
| 1192.0 | 99.29 |
| 1191.0 | 99.32 |
| 1190.0 | 99.359 |
| 1189.0 | 99.357 |
| 1188.0 | 99.326 |
| 1187.0 | 99.296 |
| 1186.0 | 99.24 |
| 1185.0 | 99.209 |
| 1184.0 | 99.255 |
| 1183.0 | 99.318 |
| 1182.0 | 99.37 |
| 1181.0 | 99.393 |
| 1180.0 | 99.386 |
| 1179.0 | 99.325 |
| 1178.0 | 99.295 |
| 1177.0 | 99.319 |
| 1176.0 | 99.367 |
| 1175.0 | 99.418 |
| 1174.0 | 99.468 |
| 1173.0 | 99.469 |
| 1172.0 | 99.423 |
| 1171.0 | 99.378 |
| 1170.0 | 99.367 |
| 1169.0 | 99.376 |
| 1168.0 | 99.411 |
| 1167.0 | 99.444 |
| 1166.0 | 99.43 |
| 1165.0 | 99.395 |
| 1164.0 | 99.397 |
| 1163.0 | 99.396 |
| 1162.0 | 99.429 |
| 1161.0 | 99.474 |
| 1160.0 | 99.499 |
| 1159.0 | 99.468 |
| 1158.0 | 99.431 |
| 1157.0 | 99.41 |
| 1156.0 | 99.396 |
| 1155.0 | 99.454 |
| 1154.0 | 99.523 |
| 1153.0 | 99.559 |
| 1152.0 | 99.557 |
| 1151.0 | 99.527 |
| 1150.0 | 99.512 |
| 1149.0 | 99.494 |
| 1148.0 | 99.548 |
| 1147.0 | 99.598 |
| 1146.0 | 99.594 |
| 1145.0 | 99.578 |
| 1144.0 | 99.538 |
| 1143.0 | 99.487 |
| 1142.0 | 99.473 |
| 1141.0 | 99.52 |
| 1140.0 | 99.543 |
| 1139.0 | 99.532 |
| 1138.0 | 99.516 |
| 1137.0 | 99.478 |
| 1136.0 | 99.461 |
| 1135.0 | 99.496 |
| 1134.0 | 99.536 |
| 1133.0 | 99.559 |
| 1132.0 | 99.563 |
| 1131.0 | 99.551 |
| 1130.0 | 99.527 |
| 1129.0 | 99.529 |
| 1128.0 | 99.581 |
| 1127.0 | 99.616 |
| 1126.0 | 99.632 |
| 1125.0 | 99.602 |
| 1124.0 | 99.571 |
| 1123.0 | 99.55 |
| 1122.0 | 99.574 |
| 1121.0 | 99.623 |
| 1120.0 | 99.635 |
| 1119.0 | 99.613 |
| 1118.0 | 99.548 |
| 1117.0 | 99.489 |
| 1116.0 | 99.485 |
| 1115.0 | 99.539 |
| 1114.0 | 99.594 |
| 1113.0 | 99.606 |
| 1112.0 | 99.573 |
| 1111.0 | 99.525 |
| 1110.0 | 99.495 |
| 1109.0 | 99.513 |
| 1108.0 | 99.578 |
| 1107.0 | 99.586 |
| 1106.0 | 99.57 |
| 1105.0 | 99.504 |
| 1104.0 | 99.466 |
| 1103.0 | 99.457 |
| 1102.0 | 99.518 |
| 1101.0 | 99.574 |
| 1100.0 | 99.576 |
| 1099.0 | 99.545 |
| 1098.0 | 99.501 |
| 1097.0 | 99.48 |
| 1096.0 | 99.502 |
| 1095.0 | 99.547 |
| 1094.0 | 99.525 |
| 1093.0 | 99.466 |
| 1092.0 | 99.427 |
| 1091.0 | 99.413 |
| 1090.0 | 99.456 |
| 1089.0 | 99.519 |
| 1088.0 | 99.522 |
| 1087.0 | 99.485 |
| 1086.0 | 99.457 |
| 1085.0 | 99.461 |
| 1084.0 | 99.485 |
| 1083.0 | 99.51 |
| 1082.0 | 99.521 |
| 1081.0 | 99.467 |
| 1080.0 | 99.41 |
| 1079.0 | 99.408 |
| 1078.0 | 99.427 |
| 1077.0 | 99.472 |
| 1076.0 | 99.456 |
| 1075.0 | 99.384 |
| 1074.0 | 99.318 |
| 1073.0 | 99.313 |
| 1072.0 | 99.379 |
| 1071.0 | 99.43 |
| 1070.0 | 99.42 |
| 1069.0 | 99.375 |
| 1068.0 | 99.33 |
| 1067.0 | 99.325 |
| 1066.0 | 99.371 |
| 1065.0 | 99.43 |
| 1064.0 | 99.406 |
| 1063.0 | 99.365 |
| 1062.0 | 99.336 |
| 1061.0 | 99.34 |
| 1060.0 | 99.366 |
| 1059.0 | 99.41 |
| 1058.0 | 99.357 |
| 1057.0 | 99.324 |
| 1056.0 | 99.305 |
| 1055.0 | 99.337 |
| 1054.0 | 99.359 |
| 1053.0 | 99.339 |
| 1052.0 | 99.266 |
| 1051.0 | 99.222 |
| 1050.0 | 99.26 |
| 1049.0 | 99.291 |
| 1048.0 | 99.295 |
| 1047.0 | 99.242 |
| 1046.0 | 99.18 |
| 1045.0 | 99.146 |
| 1044.0 | 99.19 |
| 1043.0 | 99.247 |
| 1042.0 | 99.26 |
| 1041.0 | 99.226 |
| 1040.0 | 99.196 |
| 1039.0 | 99.197 |
| 1038.0 | 99.223 |
| 1037.0 | 99.228 |
| 1036.0 | 99.191 |
| 1035.0 | 99.169 |
| 1034.0 | 99.169 |
| 1033.0 | 99.199 |
| 1032.0 | 99.202 |
| 1031.0 | 99.17 |
| 1030.0 | 99.179 |
| 1029.0 | 99.194 |
| 1028.0 | 99.211 |
| 1027.0 | 99.194 |
| 1026.0 | 99.145 |
| 1025.0 | 99.091 |
| 1024.0 | 99.081 |
| 1023.0 | 99.067 |
| 1022.0 | 99.009 |
| 1021.0 | 98.933 |
| 1020.0 | 98.917 |
| 1019.0 | 98.948 |
| 1018.0 | 98.957 |
| 1017.0 | 98.911 |
| 1016.0 | 98.833 |
| 1015.0 | 98.803 |
| 1014.0 | 98.827 |
| 1013.0 | 98.8 |
| 1012.0 | 98.745 |
| 1011.0 | 98.699 |
| 1010.0 | 98.718 |
| 1009.0 | 98.806 |
| 1008.0 | 98.86 |
| 1007.0 | 98.826 |
| 1006.0 | 98.726 |
| 1005.0 | 98.632 |
| 1004.0 | 98.447 |
| 1003.0 | 97.763 |
| 1002.0 | 96.717 |
| 1001.0 | 72.894 |
| 1000.0 | 54.45 |
| 999.0 | 49.486 |
| 998.0 | 45.897 |
| 997.0 | 42.102 |
| 996.0 | 30.697 |
| 995.0 | 24.826 |
| 994.0 | 11.867 |
| 993.0 | 4.159 |
| 992.0 | 0.552 |
| 991.0 | 0.148 |
| 990.0 | 0.123 |
| 989.0 | 0.016 |
| 988.0 | 0.008 |
| 987.0 | 0.005 |
| 986.0 | 0.002 |
| 985.0 | 0.001 |
| 984.0 | 0.001 |
| 983.0 | 0 |
| 982.0 | 0 |
| 981.0 | 0 |
| 980.0 | 0 |
| 979.0 | 0 |
| 978.0 | 0 |
| 977.0 | 0 |
| 976.0 | 0 |
| 975.0 | 0 |
| 974.0 | 0.001 |
| 973.0 | 0.001 |
| 972.0 | 0.001 |
| 971.0 | 0.001 |
| 970.0 | 0.002 |
| 969.0 | 0.008 |
| 968.0 | 0.018 |
| 967.0 | 0.115 |
| 966.0 | 0.13 |
| 965.0 | 0.212 |
| 964.0 | 0.948 |
| 963.0 | 4.479 |
| 962.0 | 12.511 |
| 961.0 | 24.365 |
| 960.0 | 40.858 |
| 959.0 | 58.614 |
| 958.0 | 74.038 |
| 957.0 | 85.678 |
| 956.0 | 93.044 |
| 955.0 | 96.358 |
| 954.0 | 97.601 |
| 953.0 | 98.272 |
| 952.0 | 98.598 |
| 951.0 | 98.774 |
| 950.0 | 98.913 |
| 949.0 | 98.931 |
| 948.0 | 98.865 |
| 947.0 | 98.845 |
| 946.0 | 98.851 |
| 945.0 | 98.85 |
| 944.0 | 98.87 |
| 943.0 | 98.907 |
| 942.0 | 98.938 |
| 941.0 | 98.951 |
| 940.0 | 98.946 |
| 939.0 | 98.966 |
| 938.0 | 98.977 |
| 937.0 | 98.979 |
| 936.0 | 98.973 |
| 935.0 | 98.971 |
| 934.0 | 98.974 |
| 933.0 | 98.954 |
| 932.0 | 98.935 |
| 931.0 | 98.951 |
| 930.0 | 98.963 |
| 929.0 | 98.964 |
| 928.0 | 98.959 |
| 927.0 | 98.982 |
| 926.0 | 99.002 |
| 925.0 | 99.02 |
| 924.0 | 99.029 |
| 923.0 | 99.061 |
| 922.0 | 99.1 |
| 921.0 | 99.124 |
| 920.0 | 99.119 |
| 919.0 | 99.126 |
| 918.0 | 99.137 |
| 917.0 | 99.125 |
| 916.0 | 99.093 |
| 915.0 | 99.087 |
| 914.0 | 99.078 |
| 913.0 | 99.07 |
| 912.0 | 99.067 |
| 911.0 | 99.069 |
| 910.0 | 99.088 |
| 909.0 | 99.1 |
| 908.0 | 99.101 |
| 907.0 | 99.115 |
| 906.0 | 99.119 |
| 905.0 | 99.141 |
| 904.0 | 99.143 |
| 903.0 | 99.152 |
| 902.0 | 99.153 |
| 901.0 | 99.166 |
| 900.0 | 99.163 |
| 899.0 | 99.165 |
| 898.0 | 99.176 |
| 897.0 | 99.18 |
| 896.0 | 99.177 |
| 895.0 | 99.198 |
| 894.0 | 99.216 |
| 893.0 | 99.222 |
| 892.0 | 99.252 |
| 891.0 | 99.272 |
| 890.0 | 99.291 |
| 889.0 | 99.306 |
| 888.0 | 99.332 |
| 887.0 | 99.337 |
| 886.0 | 99.322 |
| 885.0 | 99.338 |
| 884.0 | 99.341 |
| 883.0 | 99.33 |
| 882.0 | 99.35 |
| 881.0 | 99.355 |
| 880.0 | 99.349 |
| 879.0 | 99.353 |
| 878.0 | 99.368 |
| 877.0 | 99.367 |
| 876.0 | 99.38 |
| 875.0 | 99.397 |
| 874.0 | 99.397 |
| 873.0 | 99.393 |
| 872.0 | 99.401 |
| 871.0 | 99.406 |
| 870.0 | 99.395 |
| 869.0 | 99.407 |
| 868.0 | 99.415 |
| 867.0 | 99.401 |
| 866.0 | 99.418 |
| 865.0 | 99.426 |
| 864.0 | 99.414 |
| 863.0 | 99.414 |
| 862.0 | 99.42 |
| 861.0 | 99.424 |
| 860.0 | 99.408 |
| 859.0 | 99.41 |
| 858.0 | 99.414 |
| 857.0 | 99.389 |
| 856.0 | 99.382 |
| 855.0 | 99.371 |
| 854.0 | 99.356 |
| 853.0 | 99.344 |
| 852.0 | 99.343 |
| 851.0 | 99.325 |
| 850.0 | 99.304 |
| 849.0 | 99.091 |
| 848.0 | 98.988 |
| 847.0 | 98.955 |
| 846.0 | 98.995 |
| 845.0 | 99.023 |
| 844.0 | 99.011 |
| 843.0 | 99.12 |
| 842.0 | 99.119 |
| 841.0 | 99.174 |
| 840.0 | 99.084 |
| 839.0 | 99.148 |
| 838.0 | 99.048 |
| 837.0 | 98.968 |
| 836.0 | 98.995 |
| 835.0 | 99.037 |
| 834.0 | 99.009 |
| 833.0 | 98.923 |
| 832.0 | 98.972 |
| 831.0 | 98.966 |
| 830.0 | 99.044 |
| 829.0 | 99.018 |
| 828.0 | 99.047 |
| 827.0 | 99.012 |
| 826.0 | 99.006 |
| 825.0 | 98.916 |
| 824.0 | 98.783 |
| 823.0 | 98.788 |
| 822.0 | 98.748 |
| 821.0 | 98.745 |
| 820.0 | 98.804 |
| 819.0 | 98.839 |
| 818.0 | 98.83 |
| 817.0 | 98.813 |
| 816.0 | 98.884 |
| 815.0 | 98.924 |
| 814.0 | 98.897 |
| 813.0 | 98.911 |
| 812.0 | 98.816 |
| 811.0 | 98.796 |
| 810.0 | 98.839 |
| 809.0 | 98.805 |
| 808.0 | 98.667 |
| 807.0 | 98.605 |
| 806.0 | 98.588 |
| 805.0 | 98.574 |
| 804.0 | 98.588 |
| 803.0 | 98.618 |
| 802.0 | 98.669 |
| 801.0 | 98.727 |
| 800.0 | 98.854 |
| 799.0 | 98.951 |
| 798.0 | 98.891 |
| 797.0 | 98.845 |
| 796.0 | 98.79 |
| 795.0 | 98.756 |
| 794.0 | 98.775 |
| 793.0 | 98.824 |
| 792.0 | 98.86 |
| 791.0 | 98.778 |
| 790.0 | 98.728 |
| 789.0 | 98.682 |
| 788.0 | 98.71 |
| 787.0 | 98.723 |
| 786.0 | 98.756 |
| 785.0 | 98.758 |
| 784.0 | 98.736 |
| 783.0 | 98.76 |
| 782.0 | 98.714 |
| 781.0 | 98.601 |
| 780.0 | 98.689 |
| 779.0 | 98.762 |
| 778.0 | 98.756 |
| 777.0 | 98.739 |
| 776.0 | 98.83 |
| 775.0 | 98.87 |
| 774.0 | 98.765 |
| 773.0 | 98.625 |
| 772.0 | 98.579 |
| 771.0 | 98.605 |
| 770.0 | 98.603 |
| 769.0 | 98.605 |
| 768.0 | 98.581 |
| 767.0 | 98.686 |
| 766.0 | 98.791 |
| 765.0 | 98.718 |
| 764.0 | 98.69 |
| 763.0 | 98.691 |
| 762.0 | 98.665 |
| 761.0 | 98.621 |
| 760.0 | 98.743 |
| 759.0 | 98.697 |
| 758.0 | 98.611 |
| 757.0 | 98.674 |
| 756.0 | 98.788 |
| 755.0 | 98.777 |
| 754.0 | 98.778 |
| 753.0 | 98.879 |
| 752.0 | 98.875 |
| 751.0 | 98.871 |
| 750.0 | 99.008 |
| 749.0 | 99.008 |
| 748.0 | 98.921 |
| 747.0 | 98.924 |
| 746.0 | 99.05 |
| 745.0 | 99.1 |
| 744.0 | 99.118 |
| 743.0 | 99.095 |
| 742.0 | 99.016 |
| 741.0 | 98.905 |
| 740.0 | 98.871 |
| 739.0 | 98.748 |
| 738.0 | 98.606 |
| 737.0 | 98.694 |
| 736.0 | 98.842 |
| 735.0 | 98.851 |
| 734.0 | 98.842 |
| 733.0 | 98.878 |
| 732.0 | 98.847 |
| 731.0 | 98.762 |
| 730.0 | 98.715 |
| 729.0 | 98.71 |
| 728.0 | 98.816 |
| 727.0 | 98.872 |
| 726.0 | 98.813 |
| 725.0 | 98.714 |
| 724.0 | 98.723 |
| 723.0 | 98.576 |
| 722.0 | 98.399 |
| 721.0 | 98.346 |
| 720.0 | 98.488 |
| 719.0 | 98.576 |
| 718.0 | 98.547 |
| 717.0 | 98.506 |
| 716.0 | 98.394 |
| 715.0 | 98.265 |
| 714.0 | 98.141 |
| 713.0 | 98.113 |
| 712.0 | 98.032 |
| 711.0 | 97.855 |
| 710.0 | 97.765 |
| 709.0 | 97.625 |
| 708.0 | 97.562 |
| 707.0 | 97.774 |
| 706.0 | 98.019 |
| 705.0 | 98.051 |
| 704.0 | 98.041 |
| 703.0 | 97.973 |
| 702.0 | 97.911 |
| 701.0 | 97.847 |
| 700.0 | 97.787 |
| 699.0 | 97.841 |
| 698.0 | 97.842 |
| 697.0 | 97.68 |
| 696.0 | 97.569 |
| 695.0 | 97.597 |
| 694.0 | 97.592 |
| 693.0 | 97.485 |
| 692.0 | 97.37 |
| 691.0 | 97.248 |
| 690.0 | 97.054 |
| 689.0 | 96.674 |
| 688.0 | 96.315 |
| 687.0 | 96.126 |
| 686.0 | 96.108 |
| 685.0 | 96.297 |
| 684.0 | 96.408 |
| 683.0 | 96.266 |
| 682.0 | 96.311 |
| 681.0 | 96.62 |
| 680.0 | 96.817 |
| 679.0 | 96.857 |
| 678.0 | 96.77 |
| 677.0 | 95.337 |
| 676.0 | 88.966 |
| 675.0 | 71.617 |
| 674.0 | 45.336 |
| 673.0 | 25.253 |
| 672.0 | 16 |
| 671.0 | 10.19 |
| 670.0 | 6.858 |
| 669.0 | 5.481 |
| 668.0 | 4.367 |
| 667.0 | 3.117 |
| 666.0 | 1.874 |
| 665.0 | 1.143 |
| 664.0 | 1.018 |
| 663.0 | 1.102 |
| 662.0 | 0.769 |
| 661.0 | 0.281 |
| 660.0 | 0.049 |
| 659.0 | 0.004 |
| 658.0 | 0.004 |
| 657.0 | 0.004 |
| 656.0 | 0.004 |
| 655.0 | 0.004 |
| 654.0 | 0.004 |
| 653.0 | 0.004 |
| 652.0 | 0.004 |
| 651.0 | 0.004 |
| 650.0 | 0.004 |
| 649.0 | 0.004 |
| 648.0 | 0.004 |
| 647.0 | 0.004 |
| 646.0 | 0.004 |
| 645.0 | 0.004 |
| 644.0 | 0.004 |
| 643.0 | 0.004 |
| 642.0 | 0.004 |
| 641.0 | 0.004 |
| 640.0 | 0.004 |
| 639.0 | 0.004 |
| 638.0 | 0.004 |
| 637.0 | 0.004 |
| 636.0 | 0.004 |
| 635.0 | 0.004 |
| 634.0 | 0.004 |
| 633.0 | 0.004 |
| 632.0 | 0.004 |
| 631.0 | 0.004 |
| 630.0 | 0.004 |
| 629.0 | 0.004 |
| 628.0 | 0.004 |
| 627.0 | 0.004 |
| 626.0 | 0.004 |
| 625.0 | 0.004 |
| 624.0 | 0.004 |
| 623.0 | 0.004 |
| 622.0 | 0.004 |
| 621.0 | 0.004 |
| 620.0 | 0.004 |
| 619.0 | 0.004 |
| 618.0 | 0.004 |
| 617.0 | 0.004 |
| 616.0 | 0.004 |
| 615.0 | 0.004 |
| 614.0 | 0.004 |
| 613.0 | 0.004 |
| 612.0 | 0.004 |
| 611.0 | 0.004 |
| 610.0 | 0.004 |
| 609.0 | 0.004 |
| 608.0 | 0.004 |
| 607.0 | 0.004 |
| 606.0 | 0.004 |
| 605.0 | 0.004 |
| 604.0 | 0.004 |
| 603.0 | 0.004 |
| 602.0 | 0.004 |
| 601.0 | 0.004 |
| 600.0 | 0.004 |
| 599.0 | 0.004 |
| 598.0 | 0.004 |
| 597.0 | 0.004 |
| 596.0 | 0.004 |
| 595.0 | 0.004 |
| 594.0 | 0.004 |
| 593.0 | 0.004 |
| 592.0 | 0.004 |
| 591.0 | 0.004 |
| 590.0 | 0.004 |
| 589.0 | 0.004 |
| 588.0 | 0.004 |
| 587.0 | 0.004 |
| 586.0 | 0.004 |
| 585.0 | 0.004 |
| 584.0 | 0.004 |
| 583.0 | 0.004 |
| 582.0 | 0.004 |
| 581.0 | 0.004 |
| 580.0 | 0.004 |
| 579.0 | 0.004 |
| 578.0 | 0.003 |
| 577.0 | 0.004 |
| 576.0 | 0.004 |
| 575.0 | 0.004 |
| 574.0 | 0.004 |
| 573.0 | 0.004 |
| 572.0 | 0.004 |
| 571.0 | 0.004 |
| 570.0 | 0.003 |
| 569.0 | 0.004 |
| 568.0 | 0.003 |
| 567.0 | 0.004 |
| 566.0 | 0.003 |
| 565.0 | 0.003 |
| 564.0 | 0.003 |
| 563.0 | 0.003 |
| 562.0 | 0.003 |
| 561.0 | 0.003 |
| 560.0 | 0.003 |
| 559.0 | 0.003 |
| 558.0 | 0.003 |
| 557.0 | 0.003 |
| 556.0 | 0.003 |
| 555.0 | 0.003 |
| 554.0 | 0.003 |
| 553.0 | 0.003 |
| 552.0 | 0.003 |
| 551.0 | 0.003 |
| 550.0 | 0.003 |
| 549.0 | 0.003 |
| 548.0 | 0.003 |
| 547.0 | 0.003 |
| 546.0 | 0.003 |
| 545.0 | 0.003 |
| 544.0 | 0.003 |
| 543.0 | 0.003 |
| 542.0 | 0.003 |
| 541.0 | 0.003 |
| 540.0 | 0.003 |
| 539.0 | 0.003 |
| 538.0 | 0.003 |
| 537.0 | 0.003 |
| 536.0 | 0.003 |
| 535.0 | 0.003 |
| 534.0 | 0.003 |
| 533.0 | 0.003 |
| 532.0 | 0.003 |
| 531.0 | 0.003 |
| 530.0 | 0.003 |
| 529.0 | 0.003 |
| 528.0 | 0.003 |
| 527.0 | 0.003 |
| 526.0 | 0.003 |
| 525.0 | 0.003 |
| 524.0 | 0.003 |
| 523.0 | 0.003 |
| 522.0 | 0.003 |
| 521.0 | 0.003 |
| 520.0 | 0.003 |
| 519.0 | 0.003 |
| 518.0 | 0.003 |
| 517.0 | 0.003 |
| 516.0 | 0.003 |
| 515.0 | 0.003 |
| 514.0 | 0.003 |
| 513.0 | 0.003 |
| 512.0 | 0.003 |
| 511.0 | 0.003 |
| 510.0 | 0.003 |
| 509.0 | 0.003 |
| 508.0 | 0.003 |
| 507.0 | 0.003 |
| 506.0 | 0.003 |
| 505.0 | 0.003 |
| 504.0 | 0.003 |
| 503.0 | 0.003 |
| 502.0 | 0.003 |
| 501.0 | 0.003 |
| 500.0 | 0.003 |
| 499.0 | 0.003 |
| 498.0 | 0.003 |
| 497.0 | 0.003 |
| 496.0 | 0.003 |
| 495.0 | 0.003 |
| 494.0 | 0.003 |
| 493.0 | 0.003 |
| 492.0 | 0.003 |
| 491.0 | 0.003 |
| 490.0 | 0.003 |
| 489.0 | 0.003 |
| 488.0 | 0.003 |
| 487.0 | 0.003 |
| 486.0 | 0.003 |
| 485.0 | 0.003 |
| 484.0 | 0.002 |
| 483.0 | 0.003 |
| 482.0 | 0.003 |
| 481.0 | 0.003 |
| 480.0 | 0.003 |
| 479.0 | 0.016 |
| 478.0 | 0.117 |
| 477.0 | 0.22 |
| 476.0 | 0.18 |
| 475.0 | 0.086 |
| 474.0 | 0.063 |
| 473.0 | 0.099 |
| 472.0 | 0.142 |
| 471.0 | 0.487 |
| 470.0 | 3.608 |
| 469.0 | 7.384 |
| 468.0 | 6.937 |
| 467.0 | 4.362 |
| 466.0 | 5.703 |
| 465.0 | 12.572 |
| 464.0 | 16.885 |
| 463.0 | 10.623 |
| 462.0 | 3.039 |
| 461.0 | 1.261 |
| 460.0 | 1.557 |
| 459.0 | 1.702 |
| 458.0 | 1.453 |
| 457.0 | 1.931 |
| 456.0 | 7.478 |
| 455.0 | 13.229 |
| 454.0 | 10.134 |
| 453.0 | 3.636 |
| 452.0 | 0.79 |
| 451.0 | 1.997 |
| 450.0 | 4.566 |
| 449.0 | 5.431 |
| 448.0 | 3.005 |
| 447.0 | 1.356 |
| 446.0 | 3.026 |
| 445.0 | 4.753 |
| 444.0 | 4.232 |
| 443.0 | 3.717 |
| 442.0 | 9.683 |
| 441.0 | 17.517 |
| 440.0 | 16.003 |
| 439.0 | 11.248 |
| 438.0 | 12.53 |
| 437.0 | 16.15 |
| 436.0 | 17.163 |
| 435.0 | 16.04 |
| 434.0 | 11.001 |
| 433.0 | 4.975 |
| 432.0 | 3.118 |
| 431.0 | 4.343 |
| 430.0 | 4.527 |
| 429.0 | 4.301 |
| 428.0 | 5.057 |
| 427.0 | 4.887 |
| 426.0 | 3.62 |
| 425.0 | 2.687 |
| 424.0 | 1.959 |
| 423.0 | 1.731 |
| 422.0 | 1.677 |
| 421.0 | 0.877 |
| 420.0 | 0.109 |
| 419.0 | 0.005 |
| 418.0 | 0.003 |
| 417.0 | 0.003 |
| 416.0 | 0.001 |
| 415.0 | 0.002 |
| 414.0 | 0.002 |
| 413.0 | 0.001 |
| 412.0 | 0.002 |
| 411.0 | 0.003 |
| 410.0 | 0.003 |
| 409.0 | 0.003 |
| 408.0 | 0.003 |
| 407.0 | 0.003 |
| 406.0 | 0.003 |
| 405.0 | 0.003 |
| 404.0 | 0.003 |
| 403.0 | 0.003 |
| 402.0 | 0.003 |
| 401.0 | 0.003 |
| 400.0 | 0.003 |
| 399.0 | 0.003 |
| 398.0 | 0.003 |
| 397.0 | 0.003 |
| 396.0 | 0.003 |
| 395.0 | 0.003 |
| 394.0 | 0.001 |
| 393.0 | 0.042 |
| 392.0 | 0.103 |
| 391.0 | 0.096 |
| 390.0 | 0.04 |
| 389.0 | 0.005 |
| 388.0 | 0.004 |
| 387.0 | 0.005 |
| 386.0 | 0.032 |
| 385.0 | 0.076 |
| 384.0 | 0.079 |
| 383.0 | 0.044 |
| 382.0 | 0.044 |
| 381.0 | 0.068 |
| 380.0 | 0.053 |
| 379.0 | 0.017 |
| 378.0 | 0.002 |
| 377.0 | 0.006 |
| 376.0 | 0.03 |
| 375.0 | 0.049 |
| 374.0 | 0.031 |
| 373.0 | 0.01 |
| 372.0 | 0.003 |
| 371.0 | 0.002 |
| 370.0 | 0.001 |
| 369.0 | 0.002 |
| 368.0 | 0.007 |
| 367.0 | 0.06 |
| 366.0 | 0.165 |
| 365.0 | 0.224 |
| 364.0 | 0.146 |
| 363.0 | 0.045 |
| 362.0 | 0.13 |
| 361.0 | 0.432 |
| 360.0 | 0.785 |
| 359.0 | 0.838 |
| 358.0 | 0.611 |
| 357.0 | 0.343 |
| 356.0 | 0.144 |
| 355.0 | 0.155 |
| 354.0 | 0.357 |
| 353.0 | 0.478 |
| 352.0 | 0.313 |
| 351.0 | 0.089 |
| 350.0 | 0.003 |
| 349.0 | 0 |
| 348.0 | 0 |
| 347.0 | 0 |
| 346.0 | 0 |
| 345.0 | 0 |
| 344.0 | 0 |
| 343.0 | 0 |
| 342.0 | 0 |
| 341.0 | 0 |
| 340.0 | 0 |
| 339.0 | 0.002 |
| 338.0 | 0.002 |
| 337.0 | 0.002 |
| 336.0 | 0.002 |
| 335.0 | 0.002 |
| 334.0 | 0.002 |
| 333.0 | 0.002 |
| 332.0 | 0.002 |
| 331.0 | 0.002 |
| 330.0 | 0.002 |
| 329.0 | 0.002 |
| 328.0 | 0.002 |
| 327.0 | 0.002 |
| 326.0 | 0.002 |
| 325.0 | 0.002 |
| 324.0 | 0.002 |
| 323.0 | 0.002 |
| 322.0 | 0.002 |
| 321.0 | 0.002 |
| 320.0 | 0.002 |
| 319.0 | 0.002 |
| 318.0 | 0.002 |
| 317.0 | 0.002 |
| 316.0 | 0.002 |
| 315.0 | 0.002 |
| 314.0 | 0.002 |
| 313.0 | 0.002 |
| 312.0 | 0.002 |
| 311.0 | 0.002 |
| 310.0 | 0.002 |
| 309.0 | 0.002 |
| 308.0 | 0.002 |
| 307.0 | 0.002 |
| 306.0 | 0.002 |
| 305.0 | 0.002 |
| 304.0 | 0.002 |
| 303.0 | 0.002 |
| 302.0 | 0.002 |
| 301.0 | 0.002 |
| 300.0 | 0.002 |
| 299.0 | 0.002 |
| 298.0 | 0.002 |
| 297.0 | 0.002 |
| 296.0 | 0.002 |
| 295.0 | 0.002 |
| 294.0 | 0.002 |
| 293.0 | 0.002 |
| 292.0 | 0.003 |
| 291.0 | 0.002 |
| 290.0 | 0.002 |
| 289.0 | 0.003 |
| 288.0 | 0.002 |
| 287.0 | 0.003 |
| 286.0 | 0.003 |
| 285.0 | 0.003 |
| 284.0 | 0.003 |
| 283.0 | 0.003 |
| 282.0 | 0.003 |
| 281.0 | 0.003 |
| 280.0 | 0.003 |
| 279.0 | 0.003 |
| 278.0 | 0.003 |
| 277.0 | 0.003 |
| 276.0 | 0.003 |
| 275.0 | 0.003 |
| 274.0 | 0.003 |
| 273.0 | 0.003 |
| 272.0 | 0.003 |
| 271.0 | 0.003 |
| 270.0 | 0.003 |
| 269.0 | 0.003 |
| 268.0 | 0.003 |
| 267.0 | 0.003 |
| 266.0 | 0.003 |
| 265.0 | 0.003 |
| 264.0 | 0.003 |
| 263.0 | 0.003 |
| 262.0 | 0.003 |
| 261.0 | 0.003 |
| 260.0 | 0.003 |
| 259.0 | 0.003 |
| 258.0 | 0.003 |
| 257.0 | 0.003 |
| 256.0 | 0.003 |
| 255.0 | 0.003 |
| 254.0 | 0.003 |
| 253.0 | 0.003 |
| 252.0 | 0.003 |
| 251.0 | 0.003 |
| 250.0 | 0.003 |
| 249.0 | 0.003 |
| 248.0 | 0.003 |
| 247.0 | 0.003 |
| 246.0 | 0.003 |
| 245.0 | 0.003 |
| 244.0 | 0.003 |
| 243.0 | 0.003 |
| 242.0 | 0.003 |
| 241.0 | 0.003 |
| 240.0 | 0.003 |
| 239.0 | 0.003 |
| 238.0 | 0.003 |
| 237.0 | 0.003 |
| 236.0 | 0.003 |
| 235.0 | 0.003 |
| 234.0 | 0.003 |
| 233.0 | 0.003 |
| 232.0 | 0.003 |
| 231.0 | 0.003 |
| 230.0 | 0.003 |
| 229.0 | 0.003 |
| 228.0 | 0.003 |
| 227.0 | 0.003 |
| 226.0 | 0.003 |
| 225.0 | 0.003 |
| 224.0 | 0.003 |
| 223.0 | 0.003 |
| 222.0 | 0.003 |
| 221.0 | 0.003 |
| 220.0 | 0.003 |
| 219.0 | 0.003 |
| 218.0 | 0.003 |
| 217.0 | 0.003 |
| 216.0 | 0.003 |
| 215.0 | 0.003 |
| 214.0 | 0.003 |
| 213.0 | 0.003 |
| 212.0 | 0.003 |
| 211.0 | 0.003 |
| 210.0 | 0.003 |
| 209.0 | 0.003 |
| 208.0 | 0.003 |
| 207.0 | 0.003 |
| 206.0 | 0.003 |
| 205.0 | 0.003 |
| 204.0 | 0.003 |
| 203.0 | 0.002 |
| 202.0 | 0.003 |
| 201.0 | 0.003 |
| 200.0 | 0.003 |